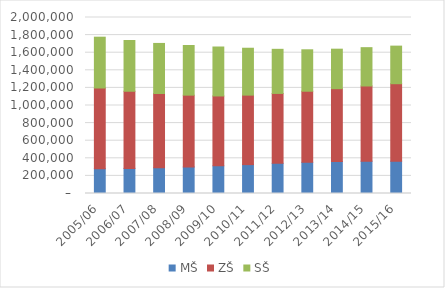
| Category | MŠ | ZŠ | SŠ |
|---|---|---|---|
| 2005/06 | 282183 | 916575 | 577605 |
| 2006/07 | 285419 | 876513 | 576585 |
| 2007/08 | 291194 | 844863 | 569267 |
| 2008/09 | 301620 | 816015 | 564326 |
| 2009/10 | 314008 | 794459 | 556260 |
| 2010/11 | 328309 | 789486 | 532918 |
| 2011/12 | 342521 | 794642 | 501220 |
| 2012/13 | 354340 | 807950 | 470754 |
| 2013/14 | 363568 | 827654 | 448792 |
| 2014/15 | 367603 | 854137 | 435542 |
| 2015/16 | 367361 | 880251 | 427107 |